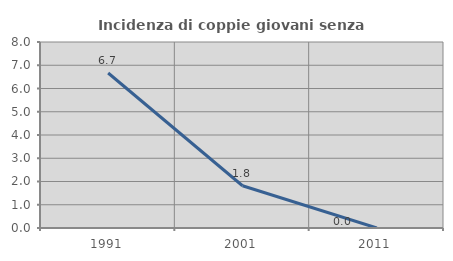
| Category | Incidenza di coppie giovani senza figli |
|---|---|
| 1991.0 | 6.667 |
| 2001.0 | 1.818 |
| 2011.0 | 0 |